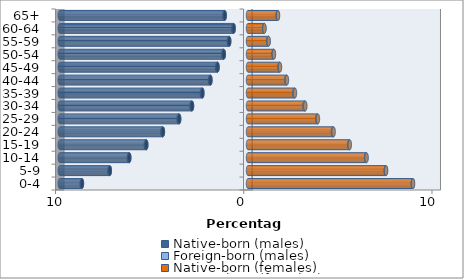
| Category | Native-born (males) | Foreign-born (males) | Native-born (females) | Foreign-born (females) |
|---|---|---|---|---|
| 0-4 | -8.821 | -0.013 | 8.756 | 0.012 |
| 5-9 | -7.343 | -0.017 | 7.321 | 0.016 |
| 10-14 | -6.307 | -0.023 | 6.277 | 0.022 |
| 15-19 | -5.404 | -0.028 | 5.378 | 0.029 |
| 20-24 | -4.52 | -0.033 | 4.512 | 0.036 |
| 25-29 | -3.658 | -0.033 | 3.677 | 0.038 |
| 30-34 | -2.975 | -0.032 | 3.007 | 0.038 |
| 35-39 | -2.423 | -0.028 | 2.461 | 0.034 |
| 40-44 | -1.996 | -0.024 | 2.039 | 0.03 |
| 45-49 | -1.62 | -0.02 | 1.676 | 0.024 |
| 50-54 | -1.287 | -0.018 | 1.359 | 0.02 |
| 55-59 | -0.999 | -0.016 | 1.08 | 0.016 |
| 60-64 | -0.763 | -0.016 | 0.861 | 0.013 |
| 65+ | -1.238 | -0.019 | 1.58 | 0.014 |